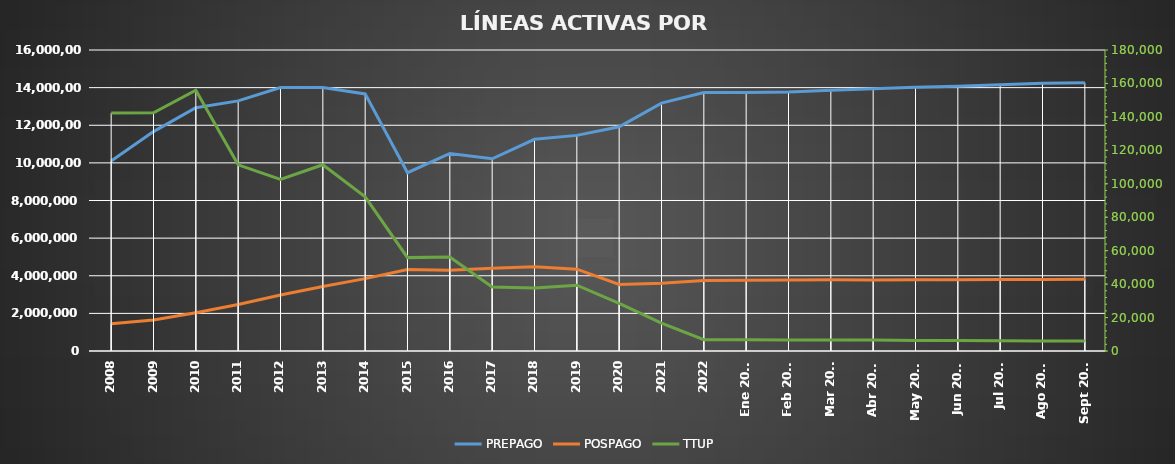
| Category | PREPAGO | POSPAGO |
|---|---|---|
| 2008 | 10097768 | 1452088 |
| 2009 | 11662294 | 1649838 |
| 2010 | 12929040 | 2033814 |
| 2011 | 13295834 | 2467378 |
| 2012 | 14008104 | 2976194 |
| 2013 | 14005126 | 3425277 |
| 2014 | 13666071 | 3846271 |
| 2015 | 9476240 | 4326937 |
| 2016 | 10498467 | 4293426 |
| 2017 | 10219457 | 4393703 |
| 2018 | 11254168 | 4480975 |
| 2019 | 11462048 | 4351686 |
| 2020 | 11917697 | 3539192 |
| 2021 | 13174530 | 3598383 |
| 2022 | 13740159 | 3743849 |
| Ene 2023 | 13744592 | 3762200 |
| Feb 2023 | 13771967 | 3773530 |
| Mar 2023 | 13859395 | 3786936 |
| Abr 2023 | 13944065 | 3768457 |
| May 2023 | 14014722 | 3780848 |
| Jun 2023 | 14075353 | 3791176 |
| Jul 2023 | 14147912 | 3799557 |
| Ago 2023 | 14231611 | 3807034 |
| Sept 2023 | 14265707 | 3810646 |